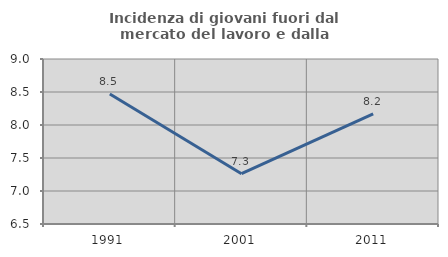
| Category | Incidenza di giovani fuori dal mercato del lavoro e dalla formazione  |
|---|---|
| 1991.0 | 8.471 |
| 2001.0 | 7.263 |
| 2011.0 | 8.168 |